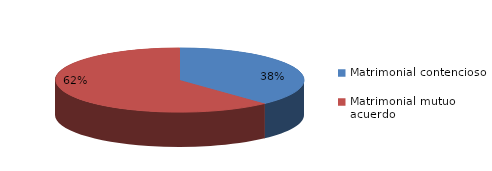
| Category | Series 0 |
|---|---|
| 0 | 297 |
| 1 | 484 |